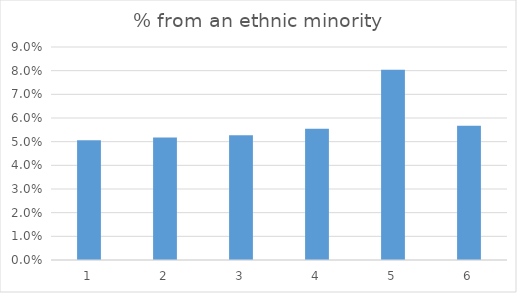
| Category | % from an ethnic minority |
|---|---|
| 0 | 0.051 |
| 1 | 0.052 |
| 2 | 0.053 |
| 3 | 0.055 |
| 4 | 0.08 |
| 5 | 0.057 |